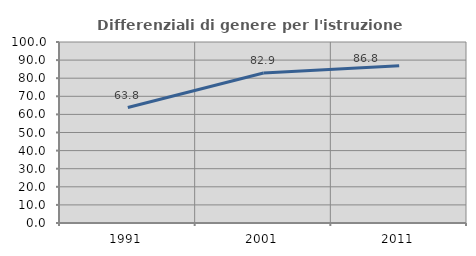
| Category | Differenziali di genere per l'istruzione superiore |
|---|---|
| 1991.0 | 63.778 |
| 2001.0 | 82.877 |
| 2011.0 | 86.839 |